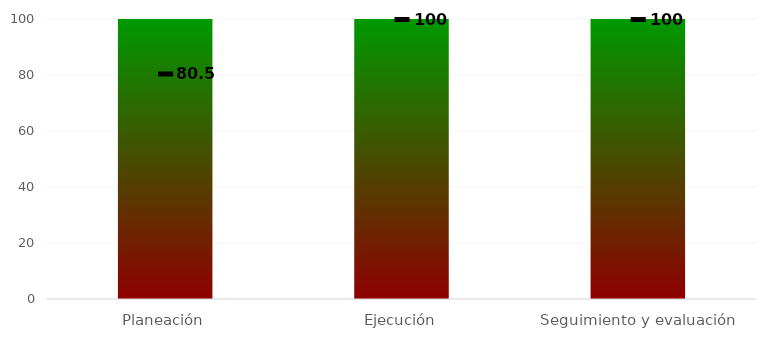
| Category | Niveles |
|---|---|
| Planeación | 100 |
| Ejecución | 100 |
| Seguimiento y evaluación | 100 |